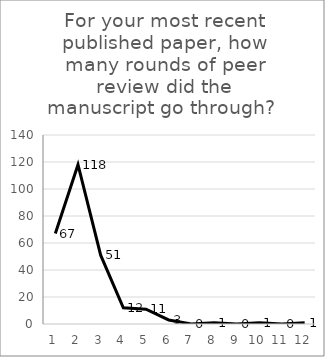
| Category | Rounds of peer review |
|---|---|
| 1.0 | 67 |
| 2.0 | 118 |
| 3.0 | 51 |
| 4.0 | 12 |
| 5.0 | 11 |
| 6.0 | 3 |
| 7.0 | 0 |
| 8.0 | 1 |
| 9.0 | 0 |
| 10.0 | 1 |
| 11.0 | 0 |
| 12.0 | 1 |